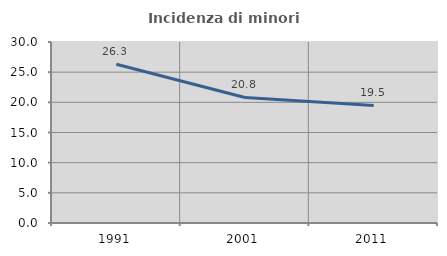
| Category | Incidenza di minori stranieri |
|---|---|
| 1991.0 | 26.316 |
| 2001.0 | 20.812 |
| 2011.0 | 19.485 |